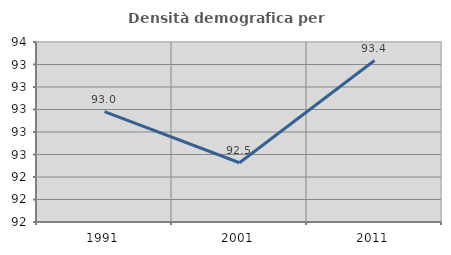
| Category | Densità demografica |
|---|---|
| 1991.0 | 92.981 |
| 2001.0 | 92.527 |
| 2011.0 | 93.435 |